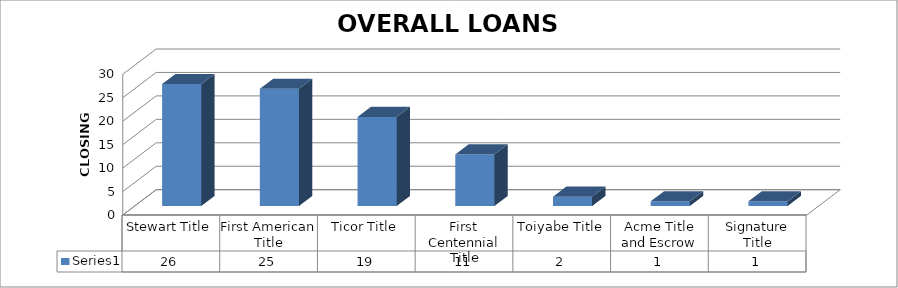
| Category | Series 0 |
|---|---|
| Stewart Title | 26 |
| First American Title | 25 |
| Ticor Title | 19 |
| First Centennial Title | 11 |
| Toiyabe Title | 2 |
| Acme Title and Escrow | 1 |
| Signature Title | 1 |